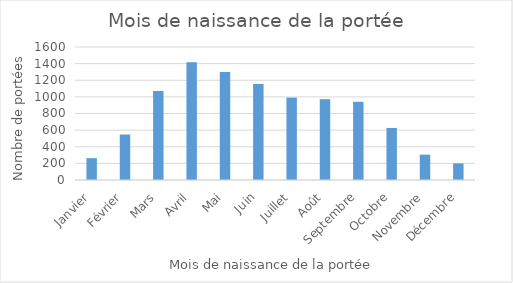
| Category | Series 0 |
|---|---|
| Janvier | 263 |
| Février | 547 |
| Mars | 1072 |
| Avril | 1417 |
| Mai | 1299 |
| Juin | 1156 |
| Juillet | 991 |
| Août | 972 |
| Septembre | 941 |
| Octobre | 626 |
| Novembre | 305 |
| Décembre | 200 |